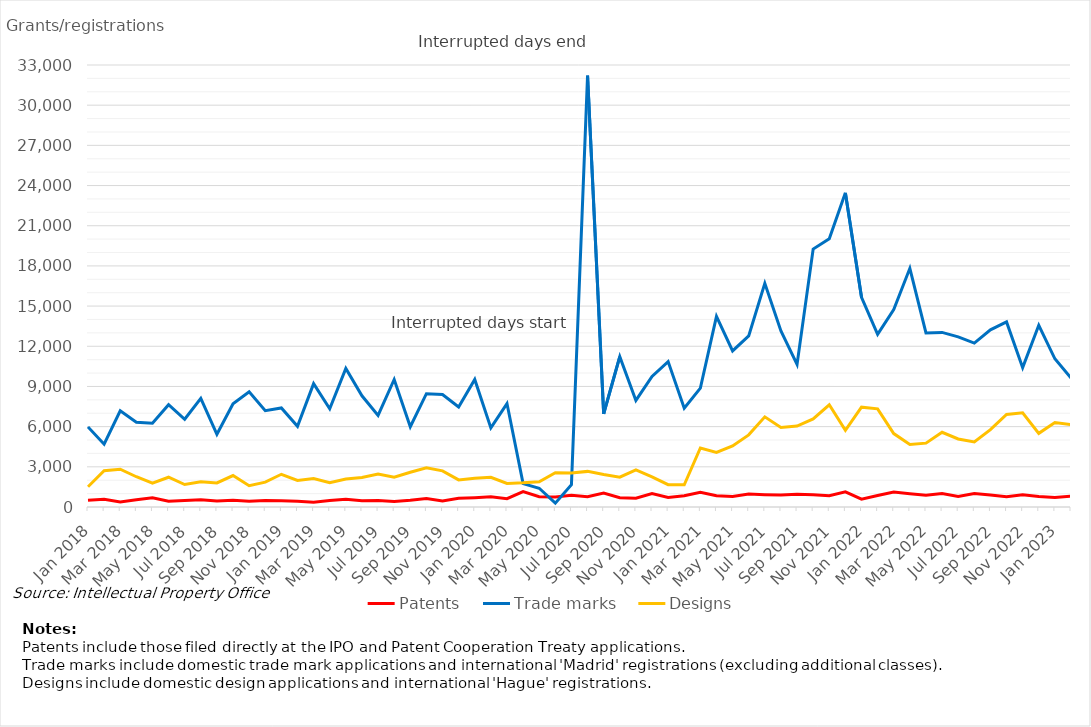
| Category | Patents | Trade marks | Designs |
|---|---|---|---|
| Jan 2018 | 495 | 5979 | 1512 |
| Feb 2018 | 574 | 4687 | 2704 |
| Mar 2018 | 370 | 7179 | 2825 |
| Apr 2018 | 543 | 6334 | 2259 |
| May 2018 | 690 | 6253 | 1789 |
| Jun 2018 | 424 | 7637 | 2222 |
| Jul 2018 | 486 | 6551 | 1678 |
| Aug 2018 | 536 | 8104 | 1878 |
| Sep 2018 | 450 | 5430 | 1795 |
| Oct 2018 | 498 | 7701 | 2348 |
| Nov 2018 | 432 | 8603 | 1592 |
| Dec 2018 | 484 | 7193 | 1859 |
| Jan 2019 | 474 | 7394 | 2444 |
| Feb 2019 | 426 | 6023 | 1987 |
| Mar 2019 | 363 | 9208 | 2125 |
| Apr 2019 | 488 | 7336 | 1810 |
| May 2019 | 573 | 10345 | 2096 |
| Jun 2019 | 471 | 8304 | 2202 |
| Jul 2019 | 489 | 6840 | 2464 |
| Aug 2019 | 420 | 9519 | 2218 |
| Sep 2019 | 500 | 5992 | 2596 |
| Oct 2019 | 634 | 8460 | 2926 |
| Nov 2019 | 455 | 8403 | 2700 |
| Dec 2019 | 654 | 7465 | 2021 |
| Jan 2020 | 696 | 9526 | 2145 |
| Feb 2020 | 756 | 5909 | 2219 |
| Mar 2020 | 622 | 7722 | 1757 |
| Apr 2020 | 1143 | 1742 | 1803 |
| May 2020 | 768 | 1399 | 1888 |
| Jun 2020 | 740 | 282 | 2564 |
| Jul 2020 | 878 | 1660 | 2539 |
| Aug 2020 | 771 | 32204 | 2659 |
| Sep 2020 | 1042 | 6950 | 2425 |
| Oct 2020 | 697 | 11225 | 2223 |
| Nov 2020 | 649 | 7956 | 2763 |
| Dec 2020 | 1010 | 9752 | 2252 |
| Jan 2021 | 708 | 10856 | 1665 |
| Feb 2021 | 838 | 7381 | 1660 |
| Mar 2021 | 1107 | 8879 | 4408 |
| Apr 2021 | 838 | 14233 | 4074 |
| May 2021 | 788 | 11655 | 4562 |
| Jun 2021 | 972 | 12773 | 5385 |
| Jul 2021 | 918 | 16695 | 6731 |
| Aug 2021 | 887 | 13147 | 5944 |
| Sep 2021 | 947 | 10648 | 6041 |
| Oct 2021 | 920 | 19254 | 6577 |
| Nov 2021 | 841 | 20029 | 7629 |
| Dec 2021 | 1131 | 23454 | 5719 |
| Jan 2022 | 585 | 15660 | 7455 |
| Feb 2022 | 860 | 12898 | 7329 |
| Mar 2022 | 1111 | 14744 | 5482 |
| Apr 2022 | 990 | 17821 | 4663 |
| May 2022 | 883 | 12993 | 4767 |
| Jun 2022 | 1010 | 13034 | 5577 |
| Jul 2022 | 788 | 12701 | 5082 |
| Aug 2022 | 1007 | 12236 | 4856 |
| Sep 2022 | 889 | 13227 | 5776 |
| Oct 2022 | 758 | 13817 | 6904 |
| Nov 2022 | 920 | 10404 | 7027 |
| Dec 2022 | 777 | 13569 | 5498 |
| Jan 2023 | 708 | 11066 | 6304 |
| Feb 2023 | 817 | 9631 | 6144 |